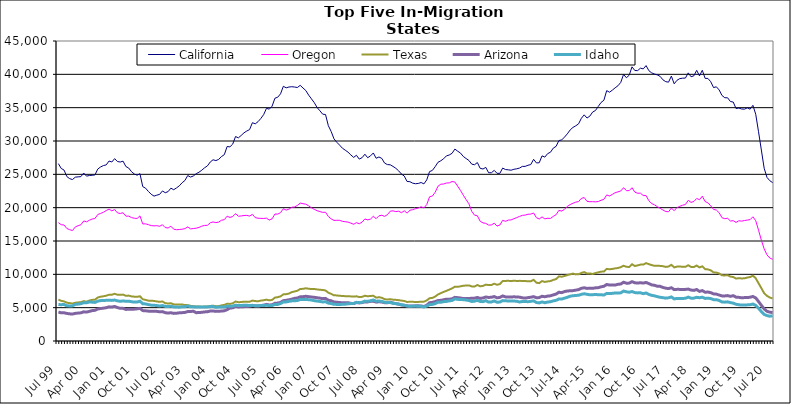
| Category | California | Oregon | Texas | Arizona | Idaho |
|---|---|---|---|---|---|
| Jul 99 | 26605 | 17749 | 6209 | 4339 | 5471 |
| Aug 99 | 25882 | 17447 | 6022 | 4228 | 5444 |
| Sep 99 | 25644 | 17401 | 5941 | 4237 | 5488 |
| Oct 99 | 24669 | 16875 | 5751 | 4134 | 5279 |
| Nov 99 | 24353 | 16701 | 5680 | 4073 | 5260 |
| Dec 99 | 24218 | 16570 | 5619 | 4042 | 5269 |
| Jan 00 | 24574 | 17109 | 5736 | 4142 | 5485 |
| Feb 00 | 24620 | 17295 | 5789 | 4192 | 5530 |
| Mar 00 | 24655 | 17436 | 5826 | 4226 | 5590 |
| Apr 00 | 25195 | 18009 | 5980 | 4375 | 5748 |
| May 00 | 24730 | 17875 | 5897 | 4337 | 5729 |
| Jun 00 | 24825 | 18113 | 6070 | 4444 | 5853 |
| Jul 00 | 24857 | 18294 | 6163 | 4555 | 5824 |
| Aug 00 | 24913 | 18376 | 6199 | 4603 | 5788 |
| Sep 00 | 25792 | 18971 | 6529 | 4804 | 5976 |
| Oct 00 | 26106 | 19135 | 6643 | 4870 | 6058 |
| Nov 00 | 26315 | 19306 | 6705 | 4926 | 6085 |
| Dec 00 | 26415 | 19570 | 6793 | 4991 | 6096 |
| Jan 01 | 26995 | 19781 | 6942 | 5122 | 6119 |
| Feb 01 | 26851 | 19519 | 6948 | 5089 | 6090 |
| Mar 01 | 27352 | 19720 | 7080 | 5180 | 6143 |
| Apr 01 | 26918 | 19221 | 6943 | 5020 | 6020 |
| May 01 | 26848 | 19126 | 6924 | 4899 | 5950 |
| Jun 01 | 26974 | 19241 | 6959 | 4895 | 6019 |
| Jul 01 | 26172 | 18725 | 6778 | 4737 | 5951 |
| Aug 01 | 25943 | 18736 | 6810 | 4757 | 5973 |
| Sep 01 | 25399 | 18514 | 6688 | 4753 | 5895 |
| Oct 01 | 25050 | 18415 | 6650 | 4780 | 5833 |
| Nov 01 | 24873 | 18381 | 6631 | 4826 | 5850 |
| Dec 01 | 25099 | 18765 | 6708 | 4898 | 5969 |
| Jan 02 | 23158 | 17561 | 6261 | 4560 | 5595 |
| Feb 02 | 22926 | 17573 | 6162 | 4531 | 5560 |
| Mar 02 | 22433 | 17452 | 6052 | 4481 | 5458 |
| Apr 02 | 22012 | 17314 | 6046 | 4458 | 5380 |
| May 02 | 21733 | 17267 | 6007 | 4452 | 5358 |
| Jun 02 | 21876 | 17298 | 5933 | 4444 | 5315 |
| Jul 02 | 21997 | 17209 | 5873 | 4383 | 5243 |
| Aug 02 | 22507 | 17436 | 5929 | 4407 | 5315 |
| Sep 02 | 22244 | 17010 | 5672 | 4248 | 5192 |
| Oct 02 | 22406 | 16952 | 5625 | 4191 | 5167 |
| Nov 02 | 22922 | 17223 | 5663 | 4242 | 5221 |
| Dec 02 | 22693 | 16770 | 5499 | 4142 | 5120 |
| Jan 03 | 22964 | 16694 | 5463 | 4166 | 5089 |
| Feb 03 | 23276 | 16727 | 5461 | 4226 | 5077 |
| Mar 03 | 23736 | 16766 | 5486 | 4251 | 5145 |
| Apr 03 | 24079 | 16859 | 5389 | 4289 | 5145 |
| May 03 | 24821 | 17117 | 5378 | 4415 | 5254 |
| Jun 03 | 24592 | 16812 | 5273 | 4426 | 5135 |
| Jul 03 | 24754 | 16875 | 5226 | 4466 | 5124 |
| Aug 03 | 25092 | 16922 | 5181 | 4244 | 5100 |
| Sep 03 | 25316 | 17036 | 5181 | 4279 | 5086 |
| Oct 03 | 25622 | 17228 | 5139 | 4301 | 5110 |
| Nov 03 | 25984 | 17335 | 5175 | 4362 | 5091 |
| Dec 03 | 26269 | 17350 | 5189 | 4396 | 5113 |
| Jan 04 | 26852 | 17734 | 5255 | 4492 | 5152 |
| Feb 04 | 27184 | 17860 | 5301 | 4502 | 5183 |
| Mar 04 | 27062 | 17757 | 5227 | 4443 | 5056 |
| Apr 04 | 27238 | 17840 | 5227 | 4461 | 5104 |
| May 04 | 27671 | 18113 | 5345 | 4493 | 5095 |
| Jun 04 | 27949 | 18201 | 5416 | 4532 | 5103 |
| Jul 04 | 29172 | 18727 | 5597 | 4697 | 5231 |
| Aug 04 | 29122 | 18529 | 5561 | 4945 | 5197 |
| Sep 04 | 29542 | 18678 | 5656 | 4976 | 5237 |
| Oct 04 | 30674 | 19108 | 5922 | 5188 | 5363 |
| Nov 04 | 30472 | 18716 | 5823 | 5106 | 5321 |
| Dec 04 | 30831 | 18755 | 5838 | 5135 | 5312 |
| Jan 05 | 31224 | 18823 | 5906 | 5155 | 5374 |
| Feb 05 | 31495 | 18842 | 5898 | 5168 | 5357 |
| Mar 05 | 31714 | 18738 | 5894 | 5212 | 5313 |
| Apr 05 | 32750 | 18998 | 6060 | 5340 | 5350 |
| May 05 | 32575 | 18504 | 5989 | 5269 | 5276 |
| Jun 05 | 32898 | 18414 | 5954 | 5252 | 5271 |
| Jul 05 | 33384 | 18395 | 6062 | 5322 | 5322 |
| Aug 05 | 33964 | 18381 | 6113 | 5375 | 5316 |
| Sep 05 | 34897 | 18426 | 6206 | 5493 | 5362 |
| Oct 05 | 34780 | 18132 | 6100 | 5408 | 5308 |
| Nov 05 | 35223 | 18332 | 6162 | 5434 | 5314 |
| Dec 05 | 36415 | 19047 | 6508 | 5658 | 5487 |
| Jan 06 | 36567 | 19032 | 6576 | 5688 | 5480 |
| Feb 06 | 37074 | 19257 | 6692 | 5792 | 5616 |
| Mar 06 | 38207 | 19845 | 6993 | 6052 | 5850 |
| Apr 06 | 37976 | 19637 | 7024 | 6101 | 5864 |
| May 06 | 38099 | 19781 | 7114 | 6178 | 5943 |
| Jun 06 | 38141 | 20061 | 7331 | 6276 | 6018 |
| Jul 06 | 38097 | 20111 | 7431 | 6399 | 6046 |
| Aug 06 | 38021 | 20333 | 7542 | 6450 | 6064 |
| Sep 06 | 38349 | 20686 | 7798 | 6627 | 6232 |
| Oct 06 | 37947 | 20591 | 7825 | 6647 | 6216 |
| Nov 06 | 37565 | 20526 | 7907 | 6707 | 6244 |
| Dec 06 | 36884 | 20272 | 7840 | 6648 | 6192 |
| Jan 07 | 36321 | 19984 | 7789 | 6597 | 6151 |
| Feb 07 | 35752 | 19752 | 7799 | 6554 | 6048 |
| Mar 07 | 35025 | 19547 | 7737 | 6487 | 5989 |
| Apr 07 | 34534 | 19412 | 7685 | 6430 | 5937 |
| May 07 | 34022 | 19296 | 7654 | 6353 | 5858 |
| Jun 07 | 33974 | 19318 | 7577 | 6390 | 5886 |
| Jul 07 | 32298 | 18677 | 7250 | 6117 | 5682 |
| Aug 07 | 31436 | 18322 | 7070 | 6034 | 5617 |
| Sep 07 | 30331 | 18087 | 6853 | 5847 | 5500 |
| Oct 07 | 29813 | 18108 | 6839 | 5821 | 5489 |
| Nov 07 | 29384 | 18105 | 6777 | 5769 | 5481 |
| Dec 07 | 28923 | 17949 | 6760 | 5733 | 5499 |
| Jan 08 | 28627 | 17890 | 6721 | 5732 | 5521 |
| Feb 08 | 28328 | 17834 | 6719 | 5749 | 5579 |
| Mar 08 | 27911 | 17680 | 6690 | 5650 | 5614 |
| Apr 08 | 27543 | 17512 | 6656 | 5612 | 5635 |
| May 08 | 27856 | 17754 | 6705 | 5774 | 5798 |
| Jun 08 | 27287 | 17589 | 6593 | 5717 | 5745 |
| Jul 08 | 27495 | 17834 | 6623 | 5761 | 5807 |
| Aug 08 | 28018 | 18309 | 6789 | 5867 | 5982 |
| Sep-08 | 27491 | 18164 | 6708 | 5864 | 5954 |
| Oct 08 | 27771 | 18291 | 6755 | 5942 | 6032 |
| Nov 08 | 28206 | 18706 | 6787 | 5970 | 6150 |
| Dec 08 | 27408 | 18353 | 6505 | 5832 | 5975 |
| Jan 09 | 27601 | 18778 | 6569 | 5890 | 5995 |
| Feb 09 | 27394 | 18863 | 6483 | 5845 | 5936 |
| Mar 09 | 26690 | 18694 | 6273 | 5751 | 5806 |
| Apr 09 | 26461 | 18943 | 6222 | 5735 | 5777 |
| May 09 | 26435 | 19470 | 6272 | 5819 | 5767 |
| Jun 09 | 26187 | 19522 | 6199 | 5700 | 5649 |
| Jul 09 | 25906 | 19408 | 6171 | 5603 | 5617 |
| Aug 09 | 25525 | 19469 | 6128 | 5533 | 5540 |
| Sep 09 | 25050 | 19249 | 6059 | 5405 | 5437 |
| Oct 09 | 24741 | 19529 | 6004 | 5349 | 5369 |
| Nov 09 | 23928 | 19187 | 5854 | 5271 | 5248 |
| Dec 09 | 23899 | 19607 | 5886 | 5261 | 5195 |
| Jan 10 | 23676 | 19703 | 5881 | 5232 | 5234 |
| Feb 10 | 23592 | 19845 | 5850 | 5272 | 5236 |
| Mar 10 | 23634 | 19946 | 5864 | 5278 | 5219 |
| Apr 10 | 23774 | 20134 | 5889 | 5257 | 5201 |
| May 10 | 23567 | 19966 | 5897 | 5172 | 5105 |
| Jun 10 | 24166 | 20464 | 6087 | 5356 | 5237 |
| Jul 10 | 25410 | 21627 | 6417 | 5742 | 5452 |
| Aug 10 | 25586 | 21744 | 6465 | 5797 | 5491 |
| Sep 10 | 26150 | 22314 | 6667 | 5907 | 5609 |
| Oct 10 | 26807 | 23219 | 6986 | 6070 | 5831 |
| Nov 10 | 27033 | 23520 | 7179 | 6100 | 5810 |
| Dec 10 | 27332 | 23551 | 7361 | 6182 | 5898 |
| Jan 11 | 27769 | 23697 | 7525 | 6276 | 5938 |
| Feb 11 | 27898 | 23718 | 7708 | 6267 | 6016 |
| Mar 11 | 28155 | 23921 | 7890 | 6330 | 6081 |
| Apr 11 | 28790 | 23847 | 8146 | 6544 | 6305 |
| May 11 | 28471 | 23215 | 8131 | 6502 | 6248 |
| Jun 11 | 28191 | 22580 | 8199 | 6445 | 6217 |
| Jul 11 | 27678 | 21867 | 8291 | 6368 | 6202 |
| Aug 11 | 27372 | 21203 | 8321 | 6356 | 6146 |
| Sep 11 | 27082 | 20570 | 8341 | 6387 | 6075 |
| Oct 11 | 26528 | 19442 | 8191 | 6402 | 5932 |
| Nov 11 | 26440 | 18872 | 8176 | 6426 | 5968 |
| Dec 11 | 26770 | 18784 | 8401 | 6533 | 6106 |
| Jan 12 | 25901 | 17963 | 8202 | 6390 | 5933 |
| Feb 12 | 25796 | 17718 | 8266 | 6456 | 5900 |
| Mar 12 | 26042 | 17647 | 8456 | 6600 | 6054 |
| Apr 12 | 25239 | 17386 | 8388 | 6534 | 5838 |
| May 12 | 25238 | 17407 | 8401 | 6558 | 5854 |
| Jun 12 | 25593 | 17673 | 8594 | 6669 | 6009 |
| Jul 12 | 25155 | 17237 | 8432 | 6474 | 5817 |
| Aug 12 | 25146 | 17391 | 8536 | 6539 | 5842 |
| Sep 12 | 25942 | 18102 | 8989 | 6759 | 6061 |
| Oct 12 | 25718 | 17953 | 9012 | 6618 | 6027 |
| Nov 12 | 25677 | 18134 | 9032 | 6611 | 6009 |
| Dec 12 | 25619 | 18166 | 8981 | 6601 | 5999 |
| Jan 13 | 25757 | 18344 | 9051 | 6627 | 5989 |
| Feb-13 | 25830 | 18512 | 9001 | 6606 | 5968 |
| Mar-13 | 25940 | 18689 | 9021 | 6577 | 5853 |
| Apr 13 | 26187 | 18844 | 9013 | 6478 | 5925 |
| May 13 | 26192 | 18884 | 9003 | 6431 | 5924 |
| Jun-13 | 26362 | 19013 | 8948 | 6508 | 5896 |
| Jul 13 | 26467 | 19037 | 8958 | 6559 | 5948 |
| Aug 13 | 27253 | 19198 | 9174 | 6655 | 6020 |
| Sep 13 | 26711 | 18501 | 8747 | 6489 | 5775 |
| Oct 13 | 26733 | 18301 | 8681 | 6511 | 5711 |
| Nov 13 | 27767 | 18620 | 8989 | 6709 | 5860 |
| Dec 13 | 27583 | 18320 | 8863 | 6637 | 5740 |
| Jan 14 | 28107 | 18409 | 8939 | 6735 | 5843 |
| Feb-14 | 28313 | 18383 | 8989 | 6779 | 5893 |
| Mar 14 | 28934 | 18696 | 9160 | 6918 | 6015 |
| Apr 14 | 29192 | 18946 | 9291 | 7036 | 6099 |
| May 14 | 30069 | 19603 | 9701 | 7314 | 6304 |
| Jun 14 | 30163 | 19487 | 9641 | 7252 | 6293 |
| Jul-14 | 30587 | 19754 | 9752 | 7415 | 6427 |
| Aug-14 | 31074 | 20201 | 9882 | 7499 | 6557 |
| Sep 14 | 31656 | 20459 | 9997 | 7536 | 6719 |
| Oct 14 | 32037 | 20663 | 10109 | 7555 | 6786 |
| Nov 14 | 32278 | 20825 | 9992 | 7628 | 6831 |
| Dec 14 | 32578 | 20918 | 10006 | 7705 | 6860 |
| Jan 15 | 33414 | 21396 | 10213 | 7906 | 7000 |
| Feb 15 | 33922 | 21518 | 10337 | 7982 | 7083 |
| Mar 15 | 33447 | 20942 | 10122 | 7891 | 7006 |
| Apr-15 | 33731 | 20893 | 10138 | 7906 | 6931 |
| May 15 | 34343 | 20902 | 10053 | 7895 | 6952 |
| Jun-15 | 34572 | 20870 | 10192 | 7973 | 6966 |
| Jul 15 | 35185 | 20916 | 10303 | 8000 | 6949 |
| Aug 15 | 35780 | 21115 | 10399 | 8126 | 6938 |
| Sep 15 | 36109 | 21246 | 10428 | 8207 | 6896 |
| Oct 15 | 37555 | 21908 | 10813 | 8477 | 7140 |
| Nov 15 | 37319 | 21750 | 10763 | 8390 | 7112 |
| Dec 15 | 37624 | 21990 | 10807 | 8395 | 7149 |
| Jan 16 | 37978 | 22248 | 10892 | 8388 | 7201 |
| Feb 16 | 38285 | 22369 | 10951 | 8508 | 7192 |
| Mar 16 | 38792 | 22506 | 11075 | 8547 | 7226 |
| Apr 16 | 39994 | 22999 | 11286 | 8815 | 7487 |
| May 16 | 39488 | 22548 | 11132 | 8673 | 7382 |
| Jun 16 | 39864 | 22556 | 11100 | 8682 | 7315 |
| Jul 16 | 41123 | 22989 | 11516 | 8903 | 7420 |
| Aug 16 | 40573 | 22333 | 11251 | 8731 | 7261 |
| Sep 16 | 40560 | 22162 | 11340 | 8692 | 7216 |
| Oct 16 | 40923 | 22172 | 11456 | 8742 | 7233 |
| Nov 16 | 40817 | 21818 | 11459 | 8685 | 7101 |
| Dec 16 | 41311 | 21815 | 11681 | 8783 | 7203 |
| Jan 17 | 40543 | 21029 | 11524 | 8609 | 6982 |
| Feb 17 | 40218 | 20613 | 11385 | 8416 | 6852 |
| Mar 17 | 40052 | 20425 | 11276 | 8354 | 6775 |
| Apr 17 | 39913 | 20147 | 11297 | 8218 | 6653 |
| May 17 | 39695 | 19910 | 11265 | 8196 | 6552 |
| Jun 17 | 39177 | 19650 | 11225 | 8034 | 6500 |
| Jul 17 | 38901 | 19419 | 11115 | 7923 | 6429 |
| Aug 17 | 38827 | 19389 | 11168 | 7867 | 6479 |
| Sep 17 | 39736 | 19936 | 11426 | 7991 | 6609 |
| Oct 17 | 38576 | 19547 | 11041 | 7708 | 6315 |
| Nov 17 | 39108 | 20013 | 11158 | 7746 | 6381 |
| Dec 17 | 39359 | 20202 | 11185 | 7743 | 6366 |
| Jan 18 | 39420 | 20362 | 11118 | 7736 | 6380 |
| Feb 18 | 39440 | 20476 | 11128 | 7741 | 6407 |
| Mar 18 | 40218 | 21106 | 11362 | 7789 | 6578 |
| Apr 18 | 39637 | 20788 | 11111 | 7642 | 6423 |
| May 18 | 39777 | 20933 | 11097 | 7591 | 6430 |
| Jun 18 | 40602 | 21381 | 11317 | 7721 | 6554 |
| Jul 18 | 39767 | 21189 | 11038 | 7445 | 6489 |
| Aug 18 | 40608 | 21729 | 11200 | 7560 | 6569 |
| Sep 18 | 39395 | 20916 | 10772 | 7318 | 6383 |
| Oct 18 | 39383 | 20724 | 10740 | 7344 | 6429 |
| Nov 18 | 38891 | 20265 | 10605 | 7255 | 6365 |
| Dec 18 | 38013 | 19741 | 10292 | 7069 | 6205 |
| Jan 19 | 38130 | 19643 | 10261 | 7032 | 6203 |
| Feb 19 | 37658 | 19237 | 10132 | 6892 | 6073 |
| Mar 19 | 36831 | 18492 | 9848 | 6766 | 5863 |
| Apr 19 | 36492 | 18349 | 9839 | 6763 | 5827 |
| May 19 | 36481 | 18407 | 9867 | 6809 | 5873 |
| Jun 19 | 35925 | 17998 | 9661 | 6698 | 5761 |
| Jul 19 | 35843 | 18049 | 9598 | 6800 | 5673 |
| Aug 19 | 34870 | 17785 | 9361 | 6577 | 5512 |
| Sep 19 | 34945 | 18038 | 9428 | 6547 | 5437 |
| Oct 19 | 34802 | 17977 | 9385 | 6483 | 5390 |
| Nov 19 | 34775 | 18072 | 9403 | 6511 | 5401 |
| Dec 19 | 34976 | 18140 | 9518 | 6521 | 5419 |
| Jan 20 | 34774 | 18209 | 9594 | 6561 | 5434 |
| Feb 20 | 35352 | 18632 | 9804 | 6682 | 5543 |
| Mar 20 | 34013 | 18041 | 9411 | 6464 | 5330 |
| Apr 20 | 31385 | 16629 | 8666 | 5922 | 4906 |
| May 20 | 28657 | 15123 | 7927 | 5355 | 4419 |
| Jun 20 | 25915 | 13817 | 7164 | 4815 | 3992 |
| Jul 20 | 24545 | 12926 | 6776 | 4457 | 3810 |
| Aug 20 | 24048 | 12443 | 6521 | 4326 | 3720 |
| Sep 20 | 23756 | 12258 | 6386 | 4266 | 3784 |